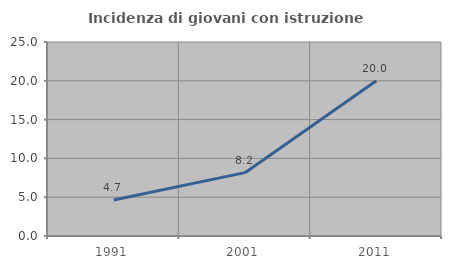
| Category | Incidenza di giovani con istruzione universitaria |
|---|---|
| 1991.0 | 4.651 |
| 2001.0 | 8.163 |
| 2011.0 | 20 |